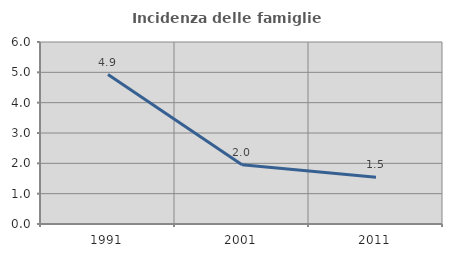
| Category | Incidenza delle famiglie numerose |
|---|---|
| 1991.0 | 4.928 |
| 2001.0 | 1.951 |
| 2011.0 | 1.537 |